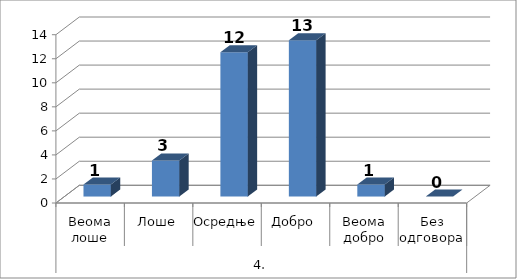
| Category | Series 0 |
|---|---|
| 0 | 1 |
| 1 | 3 |
| 2 | 12 |
| 3 | 13 |
| 4 | 1 |
| 5 | 0 |